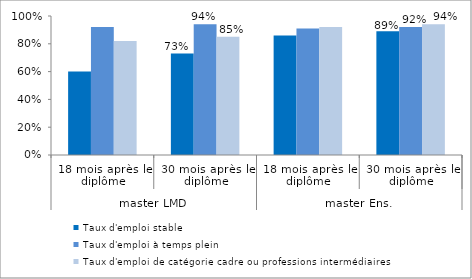
| Category | Taux d'emploi stable | Taux d'emploi à temps plein | Taux d'emploi de catégorie cadre ou professions intermédiaires |
|---|---|---|---|
| 0 | 0.6 | 0.92 | 0.82 |
| 1 | 0.73 | 0.94 | 0.85 |
| 2 | 0.86 | 0.91 | 0.92 |
| 3 | 0.89 | 0.92 | 0.94 |